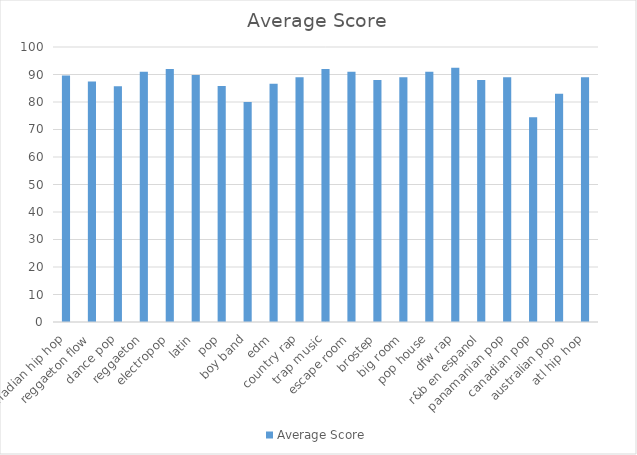
| Category | Average Score |
|---|---|
| canadian hip hop | 89.667 |
| reggaeton flow | 87.5 |
| dance pop | 85.75 |
| reggaeton | 91 |
| electropop | 92 |
| latin | 89.8 |
| pop | 85.857 |
| boy band | 80 |
| edm | 86.667 |
| country rap | 89 |
| trap music | 92 |
| escape room | 91 |
| brostep | 88 |
| big room | 89 |
| pop house | 91 |
| dfw rap | 92.5 |
| r&b en espanol | 88 |
| panamanian pop | 89 |
| canadian pop | 74.5 |
| australian pop | 83 |
| atl hip hop | 89 |